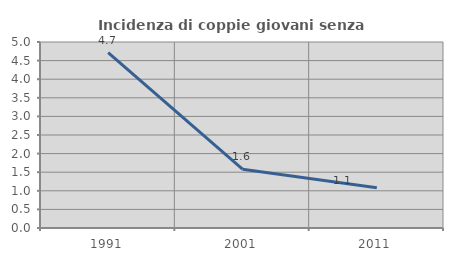
| Category | Incidenza di coppie giovani senza figli |
|---|---|
| 1991.0 | 4.713 |
| 2001.0 | 1.58 |
| 2011.0 | 1.081 |